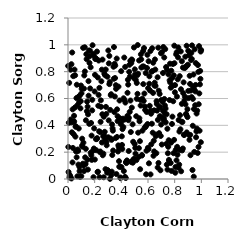
| Category | Series 0 |
|---|---|
| 0.8048160379679911 | 0.047 |
| 0.6412530690746505 | 0.173 |
| 0.036848699491668656 | 0.232 |
| 0.8508803725687043 | 0.428 |
| 0.6913978955041147 | 0.534 |
| 0.3902861109157759 | 0.093 |
| 0.5729293044220957 | 0.637 |
| 0.8110375856228726 | 0.929 |
| 0.24806886873163023 | 0.538 |
| 0.5027506385205199 | 0.779 |
| 0.44573678088368307 | 0.471 |
| 0.3434325248215889 | 0.747 |
| 0.561053336274124 | 0.839 |
| 0.24146370101987005 | 0.35 |
| 0.7851093031259042 | 0.695 |
| 0.20997103220456537 | 0.297 |
| 0.4303696479341876 | 0.57 |
| 0.10259249432398762 | 0.672 |
| 0.7798508613737885 | 0.41 |
| 0.24624403608130385 | 0.586 |
| 0.1730998822928173 | 0.418 |
| 0.8730987772841702 | 0.585 |
| 0.4771677226068377 | 0.891 |
| 0.19122029559249532 | 0.013 |
| 0.6785153978333146 | 0.12 |
| 0.03936746894879441 | 0.767 |
| 0.3206762801182168 | 0.625 |
| 0.38258311964538483 | 0.133 |
| 0.3844784113742594 | 0.091 |
| 0.3681660735472492 | 0.519 |
| 0.9689709140385898 | 0.509 |
| 0.6462743098852863 | 0.206 |
| 0.3099631757098164 | 0.917 |
| 0.8287489505397968 | 0.084 |
| 0.6857148374560557 | 0.537 |
| 0.4087598701721895 | 0.372 |
| 0.8693786946081973 | 0.33 |
| 0.8402111569531753 | 0.475 |
| 0.19983808856500268 | 0.652 |
| 0.806252504612378 | 0.089 |
| 0.29783745806520745 | 0.066 |
| 0.5157899796305667 | 0.716 |
| 0.8810528820988379 | 0.557 |
| 0.1490733598868999 | 0.07 |
| 0.4493409079521291 | 0.739 |
| 0.3490803277755809 | 0.859 |
| 0.8484357229467564 | 0.058 |
| 0.5293458375933919 | 0.164 |
| 0.4749559854918523 | 0.865 |
| 0.9367280181722548 | 0.597 |
| 0.6038354053874117 | 0.223 |
| 0.21098582234768798 | 0.896 |
| 0.12069687325942724 | 0.06 |
| 0.23005677510613035 | 0.883 |
| 0.020099144285102177 | 0.443 |
| 0.053496653326204194 | 0.773 |
| 0.14721049749832843 | 0.539 |
| 0.6044248210849298 | 0.878 |
| 0.9335570871204969 | 0.067 |
| 0.3604468680700396 | 0.672 |
| 0.643231094605576 | 0.285 |
| 0.9166533555953422 | 0.329 |
| 0.18891535484765548 | 0.933 |
| 0.37750553958991206 | 0.251 |
| 0.06481725295512407 | 0.162 |
| 0.49156706209330986 | 0.147 |
| 0.7650278276645177 | 0.86 |
| 0.7452519194500642 | 0.374 |
| 0.7916464292578508 | 0.192 |
| 0.4068009759231473 | 0.224 |
| 0.710834982930877 | 0.509 |
| 0.3133821718840352 | 0.722 |
| 0.7490497289972962 | 0.192 |
| 0.7035959168923077 | 0.257 |
| 0.3720860219728402 | 0.431 |
| 0.32833079129278914 | 0.055 |
| 0.6681677695936914 | 0.51 |
| 0.8272894318442069 | 0.981 |
| 0.04891064579619808 | 0.815 |
| 0.16629359704728555 | 0.675 |
| 0.023419354639812224 | 0.422 |
| 0.7985722187898523 | 0.863 |
| 0.16991982198271896 | 0.833 |
| 0.15444429967702467 | 0.621 |
| 0.18132061599412014 | 0.511 |
| 0.1702111666286856 | 0.195 |
| 0.9632057759010246 | 0.354 |
| 0.19315112764321993 | 0.921 |
| 0.31952743968310005 | 0.302 |
| 0.5693081703095949 | 0.838 |
| 0.004251761930587647 | 0.052 |
| 0.7430421501633343 | 0.813 |
| 0.697427239802067 | 0.937 |
| 0.9724679511926295 | 0.194 |
| 0.2173645918353844 | 0.95 |
| 0.9247368946319299 | 0.94 |
| 0.3632946576171775 | 0.037 |
| 0.5954264067940941 | 0.926 |
| 0.46419356395634676 | 0.763 |
| 0.6228622303132113 | 0.487 |
| 0.057300796040171006 | 0.389 |
| 0.4566102081277897 | 0.456 |
| 0.10893398358415206 | 0.241 |
| 0.6988001847450622 | 0.406 |
| 0.5646004305925687 | 0.707 |
| 0.33209803322518666 | 0.179 |
| 0.8081089625540443 | 0.217 |
| 0.596931256951981 | 0.41 |
| 0.3476574740772269 | 0.498 |
| 0.1397871017129596 | 0.893 |
| 0.45891351403084435 | 0.799 |
| 0.7169305897725119 | 0.44 |
| 0.9788435390067388 | 0.239 |
| 0.5787156323363809 | 0.515 |
| 0.7810713402161075 | 0.753 |
| 0.18611837737125309 | 0.209 |
| 0.05574871979741117 | 0.316 |
| 0.6547178969240556 | 0.816 |
| 0.17496583944255623 | 0.177 |
| 0.058492048325131656 | 0.393 |
| 0.2678159602451641 | 0.013 |
| 0.9384272792149398 | 0.688 |
| 0.1375155422211428 | 0.93 |
| 0.5160043820291768 | 0.597 |
| 0.695459926332687 | 0.321 |
| 0.8390021300136582 | 0.217 |
| 0.5818468911274911 | 0.389 |
| 0.9431416118818199 | 0.017 |
| 0.3654362141563176 | 0.898 |
| 0.35707544375562 | 0.305 |
| 0.7148270507419545 | 0.984 |
| 0.626209773768254 | 0.8 |
| 0.13431791821315836 | 0.438 |
| 0.9470443444692167 | 0.202 |
| 0.5500117425196831 | 0.831 |
| 0.9153122706672439 | 0.708 |
| 0.3588409693787901 | 0.699 |
| 0.5316174513720017 | 0.23 |
| 0.6642284447830702 | 0.58 |
| 0.7004161813679188 | 0.589 |
| 0.6769812162106348 | 0.979 |
| 0.3511859927170877 | 0.615 |
| 0.5750788586440214 | 0.383 |
| 0.8186558311569169 | 0.24 |
| 0.5678505033831696 | 0.582 |
| 0.2934922295686538 | 0.047 |
| 0.6314525070198469 | 0.975 |
| 0.28744572002241525 | 0.485 |
| 0.07585643305672715 | 0.209 |
| 0.32721904516621003 | 0.292 |
| 0.2792917243822691 | 0.773 |
| 0.1784138644780996 | 0.142 |
| 0.03143687584005224 | 0.943 |
| 0.576562385706362 | 0.54 |
| 0.37175541279924923 | 0.468 |
| 0.46128121574113173 | 0.852 |
| 0.8016925349532842 | 0.646 |
| 0.0025459312360142203 | 0.239 |
| 0.7255467778042767 | 0.49 |
| 0.8432535680032459 | 0.371 |
| 0.011003315112321476 | 0.012 |
| 0.7592884501775933 | 0.13 |
| 0.5193021105814963 | 0.774 |
| 0.7622489972222245 | 0.735 |
| 0.20782627532021755 | 0.9 |
| 0.07356854222332326 | 0.22 |
| 0.4187776700320601 | 0.059 |
| 0.9803273252812976 | 0.557 |
| 0.12572369945368816 | 0.982 |
| 0.9962262809924376 | 0.274 |
| 0.955091528708835 | 0.653 |
| 0.6069447748188267 | 0.117 |
| 0.5394631853148955 | 0.282 |
| 0.22332432873438213 | 0.757 |
| 0.8957698591122799 | 0.52 |
| 0.7891461199333766 | 0.58 |
| 0.0996434141433899 | 0.021 |
| 0.41515034023000635 | 0.387 |
| 0.5905139478385715 | 0.499 |
| 0.41675038389553093 | 0.601 |
| 0.773657236450272 | 0.271 |
| 0.44212130910114417 | 0.139 |
| 0.02567283399442044 | 0.856 |
| 0.7357055891118258 | 0.834 |
| 0.712584043953238 | 0.79 |
| 0.3528253194551974 | 0.752 |
| 0.12858840296570873 | 0.161 |
| 0.3243486007848635 | 0.029 |
| 0.7292748688178311 | 0.968 |
| 0.6128191903510176 | 0.545 |
| 0.2652916094593917 | 0.189 |
| 0.17699813911388584 | 0.323 |
| 0.18206875130349506 | 0.59 |
| 0.03367878854220705 | 0.124 |
| 0.20457784158936188 | 0.894 |
| 0.35437475748089486 | 0.845 |
| 0.30188381878609855 | 0.311 |
| 0.7832535737038714 | 0.465 |
| 0.8378237581727616 | 0.767 |
| 0.8878453451417957 | 0.478 |
| 0.7227709617211416 | 0.596 |
| 0.27119482135427997 | 0.323 |
| 0.6741525502740761 | 0.44 |
| 0.2846269977825291 | 0.538 |
| 0.04248283480025894 | 0.334 |
| 0.10569333759641586 | 0.249 |
| 0.3149154482639664 | 0.001 |
| 0.10613027869866468 | 0.3 |
| 0.6008738392626107 | 0.677 |
| 0.5583455519500062 | 0.36 |
| 0.019526181794592687 | 0.815 |
| 0.7319281915286389 | 0.525 |
| 0.3863287146455442 | 0.585 |
| 0.2502086209785679 | 0.728 |
| 0.5118125078379672 | 0.468 |
| 0.9359485178314961 | 0.397 |
| 0.02626952171052562 | 0.004 |
| 0.6189620236211834 | 0.034 |
| 0.32380969739468063 | 0.632 |
| 0.23548311139305195 | 0.679 |
| 0.08802271889430067 | 0.622 |
| 0.3303849235876428 | 0.407 |
| 0.5362201288249856 | 0.43 |
| 0.39445658199639444 | 0.006 |
| 0.8211185322290097 | 0.181 |
| 0.884926725820854 | 0.485 |
| 0.554770012315542 | 0.178 |
| 0.5047507612138872 | 0.231 |
| 0.8138530986290082 | 0.139 |
| 0.4936511180437289 | 0.753 |
| 0.5257141636804944 | 0.784 |
| 0.07729899798224192 | 0.612 |
| 0.22195285289826638 | 0.052 |
| 0.6611505145517063 | 0.331 |
| 0.48879040461983303 | 0.278 |
| 0.2574499699053005 | 0.483 |
| 0.15372361772268164 | 0.729 |
| 0.12216927066635556 | 0.772 |
| 0.9569947193062386 | 0.701 |
| 0.80283383021104 | 0.7 |
| 0.2272596090131578 | 0.546 |
| 0.7329941121807774 | 0.422 |
| 0.05169937658675466 | 0.533 |
| 0.2389293736291419 | 0.201 |
| 0.19409776975635853 | 0.227 |
| 0.1114741315942896 | 0.114 |
| 0.09720404005544354 | 0.697 |
| 0.40507617500263177 | 0.254 |
| 0.012877030387724989 | 0.029 |
| 0.006186548690355044 | 0.419 |
| 0.6480284451013497 | 0.697 |
| 0.49990928045378746 | 0.262 |
| 0.08582776277927397 | 0.09 |
| 0.3066266022679924 | 0.862 |
| 0.9495267015247435 | 0.662 |
| 0.6338795058866682 | 0.805 |
| 0.09564642717308515 | 0.58 |
| 0.845718230965016 | 0.951 |
| 0.8798297608187026 | 0.912 |
| 0.6104640549995154 | 0.765 |
| 0.9773982121956997 | 0.798 |
| 0.9023455612930342 | 0.657 |
| 0.2024244632717279 | 0.776 |
| 0.33630020221003804 | 0.36 |
| 0.09334830717075344 | 0.527 |
| 0.436367324262943 | 0.125 |
| 0.4037290532755966 | 0.318 |
| 0.5858075881716347 | 0.035 |
| 0.5639277297016065 | 0.954 |
| 0.7377081769587723 | 0.262 |
| 0.5701948762098781 | 0.976 |
| 0.2982828558493133 | 0.064 |
| 0.06602702955017496 | 0.703 |
| 0.7767001165413997 | 0.06 |
| 0.8540516027454408 | 0.878 |
| 0.2885757618384845 | 0.275 |
| 0.5536851859976736 | 0.175 |
| 0.8714939164513476 | 0.328 |
| 0.8169132408031525 | 0.614 |
| 0.9604627735899908 | 0.311 |
| 0.13353072803829116 | 0.225 |
| 0.16116040444494234 | 0.865 |
| 0.645677240170929 | 0.512 |
| 0.8923328184327886 | 0.844 |
| 0.2445044592955393 | 0.426 |
| 0.49742016741247386 | 0.15 |
| 0.5212950531172788 | 0.635 |
| 0.46291493973622916 | 0.5 |
| 0.22435324083276867 | 0.054 |
| 0.11328195037163839 | 0.977 |
| 0.04542772198222292 | 0.471 |
| 0.14172102281630997 | 0.505 |
| 0.8233251014317677 | 0.743 |
| 0.38136331223588515 | 0.236 |
| 0.5447603854827491 | 0.547 |
| 0.44630200163421735 | 0.643 |
| 0.6152622673486504 | 0.66 |
| 0.06954432759656205 | 0.549 |
| 0.9538337138075925 | 0.55 |
| 0.07823886163864259 | 0.108 |
| 0.29567267988940527 | 0.763 |
| 0.6209758316676542 | 0.51 |
| 0.4711321878775796 | 0.35 |
| 0.46733872729850434 | 0.88 |
| 0.04623738387279152 | 0.43 |
| 0.9185754063880479 | 0.177 |
| 0.9111752724431398 | 0.292 |
| 0.9930836196339418 | 0.746 |
| 0.90451054648089 | 0.603 |
| 0.8899003543592757 | 0.993 |
| 0.693345514646579 | 0.065 |
| 0.5431662295309747 | 0.589 |
| 0.3896380970998756 | 0.452 |
| 0.30515867955544 | 0.437 |
| 0.029177174765890736 | 0.348 |
| 0.03473832320113161 | 0.519 |
| 0.5886629924351962 | 0.211 |
| 0.835591764989214 | 0.354 |
| 0.9950032082174447 | 0.95 |
| 0.2588373860797932 | 0.89 |
| 0.060135003793550426 | 0.205 |
| 0.7463788877903434 | 0.07 |
| 0.592633580028227 | 0.827 |
| 0.3162496985230245 | 0.515 |
| 0.20126166044251567 | 0.145 |
| 0.6241956494478965 | 0.258 |
| 0.08679455388774969 | 0.059 |
| 0.9274336521782525 | 0.611 |
| 0.7091191694231516 | 0.575 |
| 0.6804002939747648 | 0.658 |
| 0.5352446029543049 | 0.452 |
| 0.982633620595707 | 0.99 |
| 0.0014173401793039727 | 0.843 |
| 0.41253459651920354 | 0.45 |
| 0.42771417932345396 | 0.016 |
| 0.3024526287686202 | 0.958 |
| 0.5869260479446795 | 0.397 |
| 0.9847453372522129 | 0.638 |
| 0.9502558711059987 | 0.967 |
| 0.48625964030769175 | 0.121 |
| 0.40118843626863987 | 0.089 |
| 0.26075685522955766 | 0.177 |
| 0.19626981598331356 | 0.377 |
| 0.8961353264265077 | 0.462 |
| 0.008951014118490511 | 0.716 |
| 0.8670603424126889 | 0.72 |
| 0.9716295100431026 | 0.363 |
| 0.4686047192664362 | 0.585 |
| 0.7047381538014715 | 0.945 |
| 0.12635470994151074 | 0.802 |
| 0.31008074148234 | 0.707 |
| 0.374935448754331 | 0.205 |
| 0.3447304075864913 | 0.983 |
| 0.27539367529782316 | 0.352 |
| 0.9126504838109599 | 0.769 |
| 0.7666258164017056 | 0.72 |
| 0.28295579248363056 | 0.816 |
| 0.508342251192858 | 0.739 |
| 0.39321054214407003 | 0.011 |
| 0.26812384855005045 | 0.464 |
| 0.48136507836854203 | 0.886 |
| 0.8472000293063932 | 0.669 |
| 0.6095097475139214 | 0.71 |
| 0.1566214265517475 | 0.958 |
| 0.7397729982779764 | 0.482 |
| 0.8538222985448833 | 0.56 |
| 0.28131536653435685 | 0.073 |
| 0.5410113143359803 | 0.073 |
| 0.16263601469403038 | 0.915 |
| 0.6719616360124111 | 0.758 |
| 0.5008025319284766 | 0.817 |
| 0.9450038752325354 | 0.522 |
| 0.7218275351179362 | 0.906 |
| 0.36753989602754356 | 0.313 |
| 0.9644264661205062 | 0.488 |
| 0.24244693615111684 | 0.205 |
| 0.4552812150957252 | 0.208 |
| 0.7934859104057508 | 0.773 |
| 0.861456895910077 | 0.227 |
| 0.23647019126137492 | 0.014 |
| 0.7708872536418231 | 0.681 |
| 0.4523679563511088 | 0.438 |
| 0.435180899166777 | 0.126 |
| 0.8562217136463667 | 0.213 |
| 0.1841013702159052 | 0.997 |
| 0.4219888138147045 | 0.905 |
| 0.9236828227154171 | 0.887 |
| 0.11961414322667153 | 0.674 |
| 0.7569432886640876 | 0.142 |
| 0.9912602430137946 | 0.805 |
| 0.8759689700202944 | 0.827 |
| 0.23329685106903708 | 0.355 |
| 0.3784666447933918 | 0.689 |
| 0.76153144905519 | 0.589 |
| 0.6887186105020155 | 0.468 |
| 0.7956687180878755 | 0.292 |
| 0.719378736267653 | 0.45 |
| 0.041499562839395265 | 0.424 |
| 0.09057465893928303 | 0.015 |
| 0.7746516469322732 | 0.807 |
| 0.7553424669311714 | 0.289 |
| 0.9665617627023164 | 0.376 |
| 0.3987209460061791 | 0.804 |
| 0.9742837852943418 | 0.849 |
| 0.4844253448565549 | 0.407 |
| 0.7269521220533531 | 0.548 |
| 0.9069609003898131 | 0.922 |
| 0.6872224141608977 | 0.634 |
| 0.5829618563947645 | 0.79 |
| 0.4335052004827897 | 0.007 |
| 0.13169487578507857 | 0.112 |
| 0.6566089395323323 | 0.694 |
| 0.2639255128353661 | 0.318 |
| 0.2765287404126788 | 0.294 |
| 0.6390117044772514 | 0.867 |
| 0.9301674912684056 | 0.996 |
| 0.5992929948883348 | 0.232 |
| 0.8153905685128157 | 0.945 |
| 0.9205150469132967 | 0.659 |
| 0.4259065800518511 | 0.444 |
| 0.8583198121879995 | 0.425 |
| 0.016319693774990665 | 0.021 |
| 0.513187397122194 | 0.141 |
| 0.6663663677588026 | 0.559 |
| 0.11756236196857932 | 0.1 |
| 0.4729816625497727 | 0.127 |
| 0.06354872401932923 | 0.603 |
| 0.7516971592958311 | 0.24 |
| 0.7074827867167729 | 0.458 |
| 0.8300571113545581 | 0.44 |
| 0.4414608648082849 | 0.132 |
| 0.3342864665711034 | 0.377 |
| 0.9583146697958732 | 0.864 |
| 0.3386570557855668 | 0.212 |
| 0.9411610354700035 | 0.779 |
| 0.5262022897289605 | 0.345 |
| 0.7867224411858997 | 0.857 |
| 0.4288211925171365 | 0.836 |
| 0.4382168163578531 | 0.119 |
| 0.5229539007081078 | 0.998 |
| 0.833956175453485 | 0.107 |
| 0.6356167118776629 | 0.345 |
| 0.9019803704293399 | 0.955 |
| 0.49475358526100255 | 0.98 |
| 0.14583691243497582 | 0.144 |
| 0.8620066643203624 | 0.83 |
| 0.7974026840709623 | 0.994 |
| 0.7699843633873352 | 0.119 |
| 0.3411244877127755 | 0.837 |
| 0.08046556629204787 | 0.376 |
| 0.15036181048545097 | 0.482 |
| 0.5062537922012279 | 0.188 |
| 0.014703220502637145 | 0.013 |
| 0.6725819227668881 | 0.086 |
| 0.989411404189051 | 0.705 |
| 0.21224475868005416 | 0.214 |
| 0.8993334392982846 | 0.852 |
| 0.39648743595194247 | 0.409 |
| 0.4236894743046 | 0.588 |
| 0.7534884722674006 | 0.78 |
| 0.533160720813824 | 0.883 |
| 0.1011751668344194 | 0.638 |
| 0.27282527164016507 | 0.783 |
| 0.2900080108782295 | 0.251 |
| 0.48282163197100664 | 0.135 |
| 0.08239851724877918 | 0.569 |
| 0.9985994271823669 | 0.961 |
| 0.629030960506534 | 0.412 |
| 0.6521424917634908 | 0.891 |
| 0.2543821224929723 | 0.272 |
| 0.2184824302737793 | 0.305 |
| 0.9094795172371621 | 0.326 |
| 0.41083057306726245 | 0.438 |
| 0.9284357248829761 | 0.895 |
| 0.6626427791664942 | 0.192 |
| 0.6581896940297888 | 0.319 |
| 0.25399014575965473 | 0.815 |
| 0.5490534452314146 | 0.892 |
| 0.47865498994771744 | 0.532 |
| 0.7411382445262601 | 0.107 |
| 0.0705422653985541 | 0.02 |
| 0.14342377212769908 | 0.577 |
| 0.1644417291298606 | 0.956 |
| 0.11558285317234294 | 0.271 |
| 0.6179660438168715 | 0.954 |
| 0.5466750071893155 | 0.929 |
| 0.8832712474533523 | 0.836 |
| 0.6503352628211341 | 0.718 |
| 0.6378421120396448 | 0.642 |
| 0.556653714259773 | 0.598 |
| 0.864092065002325 | 0.64 |
| 0.4513612883704159 | 0.704 |
| 0.8765018873034283 | 0.614 |
| 0.21545099588051694 | 0.298 |
| 0.22934550306465137 | 0.627 |
| 0.9868953963175638 | 0.36 |
| 0.6834623554245248 | 0.342 |
| 0.8904267720241162 | 0.348 |
| 0.8255797019972418 | 0.907 |
| 0.1595955461793569 | 0.411 |